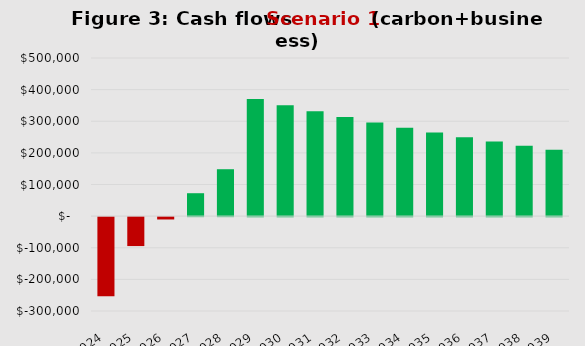
| Category | Series 0 |
|---|---|
| 2024.0 | -250000 |
| 2025.0 | -91500 |
| 2026.0 | -7425 |
| 2027.0 | 72446.25 |
| 2028.0 | 148323.938 |
| 2029.0 | 370407.741 |
| 2030.0 | 350387.354 |
| 2031.0 | 331367.986 |
| 2032.0 | 313299.587 |
| 2033.0 | 296134.607 |
| 2034.0 | 279827.877 |
| 2035.0 | 264336.483 |
| 2036.0 | 249619.659 |
| 2037.0 | 235638.676 |
| 2038.0 | 222356.742 |
| 2039.0 | 209738.905 |